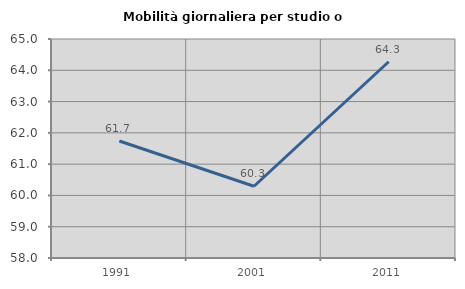
| Category | Mobilità giornaliera per studio o lavoro |
|---|---|
| 1991.0 | 61.741 |
| 2001.0 | 60.294 |
| 2011.0 | 64.272 |